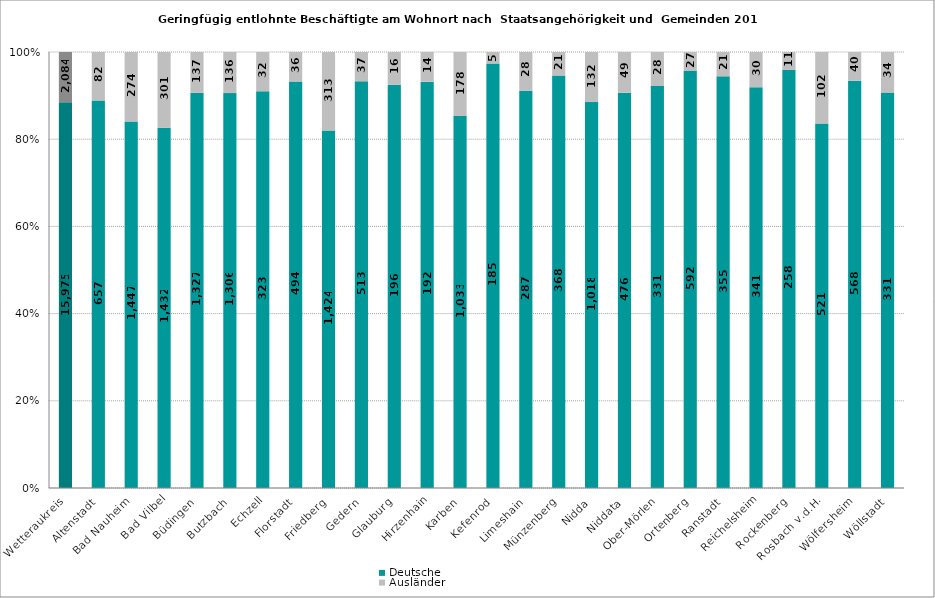
| Category | Deutsche | Ausländer |
|---|---|---|
| Wetteraukreis | 15975 | 2084 |
| Altenstadt | 657 | 82 |
| Bad Nauheim | 1447 | 274 |
| Bad Vilbel | 1432 | 301 |
| Büdingen | 1327 | 137 |
| Butzbach | 1306 | 136 |
| Echzell | 323 | 32 |
| Florstadt | 494 | 36 |
| Friedberg | 1424 | 313 |
| Gedern | 513 | 37 |
| Glauburg | 196 | 16 |
| Hirzenhain | 192 | 14 |
| Karben | 1033 | 178 |
| Kefenrod | 185 | 5 |
| Limeshain | 287 | 28 |
| Münzenberg | 368 | 21 |
| Nidda | 1018 | 132 |
| Niddata | 476 | 49 |
| Ober-Mörlen | 331 | 28 |
| Ortenberg | 592 | 27 |
| Ranstadt | 355 | 21 |
| Reichelsheim | 341 | 30 |
| Rockenberg | 258 | 11 |
| Rosbach v.d.H. | 521 | 102 |
| Wölfersheim | 568 | 40 |
| Wöllstadt | 331 | 34 |